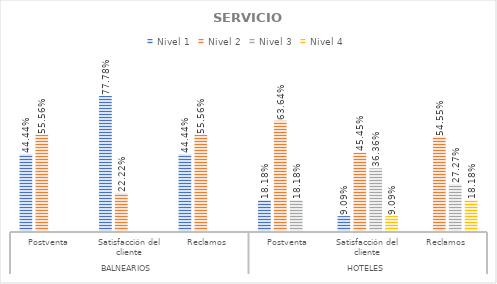
| Category | Nivel 1 | Nivel 2 | Nivel 3 | Nivel 4 |
|---|---|---|---|---|
| 0 | 0.444 | 0.556 | 0 | 0 |
| 1 | 0.778 | 0.222 | 0 | 0 |
| 2 | 0.444 | 0.556 | 0 | 0 |
| 3 | 0.182 | 0.636 | 0.182 | 0 |
| 4 | 0.091 | 0.455 | 0.364 | 0.091 |
| 5 | 0 | 0.545 | 0.273 | 0.182 |